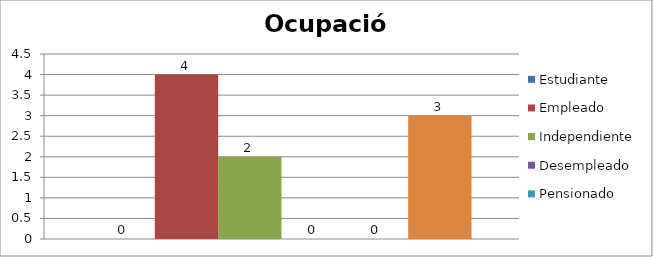
| Category | Estudiante | Empleado | Independiente | Desempleado  | Pensionado | Ama de casa |
|---|---|---|---|---|---|---|
| 0 | 0 | 4 | 2 | 0 | 0 | 3 |